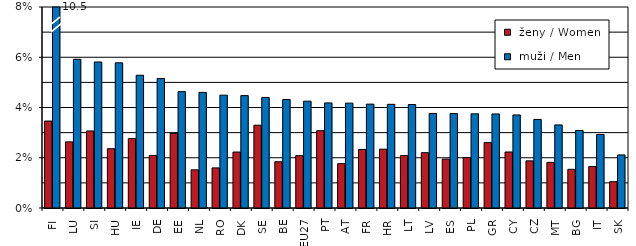
| Category |  ženy / Women |  muži / Men |
|---|---|---|
| FI | 3.461 | 10.535 |
| LU | 2.631 | 5.92 |
| SI | 3.066 | 5.811 |
| HU | 2.36 | 5.778 |
| IE | 2.768 | 5.283 |
| DE | 2.092 | 5.153 |
| EE | 2.969 | 4.631 |
| NL | 1.519 | 4.601 |
| RO | 1.597 | 4.491 |
| DK | 2.228 | 4.473 |
| SE | 3.295 | 4.4 |
| BE | 1.841 | 4.318 |
| EU27 | 2.083 | 4.252 |
| PT | 3.077 | 4.183 |
| AT | 1.765 | 4.174 |
| FR | 2.33 | 4.134 |
| HR | 2.341 | 4.126 |
| LT | 2.088 | 4.117 |
| LV | 2.201 | 3.763 |
| ES | 1.947 | 3.759 |
| PL | 2.006 | 3.748 |
| GR | 2.603 | 3.743 |
| CY | 2.229 | 3.704 |
| CZ | 1.876 | 3.525 |
| MT | 1.816 | 3.307 |
| BG | 1.54 | 3.084 |
| IT | 1.651 | 2.926 |
| SK | 1.048 | 2.112 |